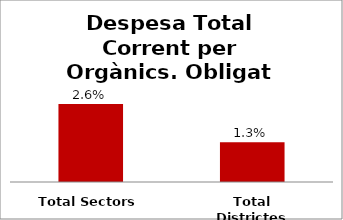
| Category | Series 0 |
|---|---|
| Total Sectors | 0.026 |
| Total Districtes | 0.013 |